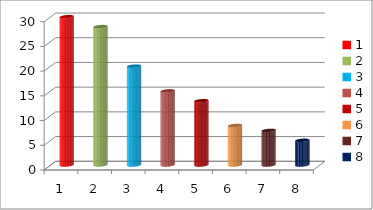
| Category | Series 0 |
|---|---|
| 0 | 30 |
| 1 | 28 |
| 2 | 20 |
| 3 | 15 |
| 4 | 13 |
| 5 | 8 |
| 6 | 7 |
| 7 | 5 |